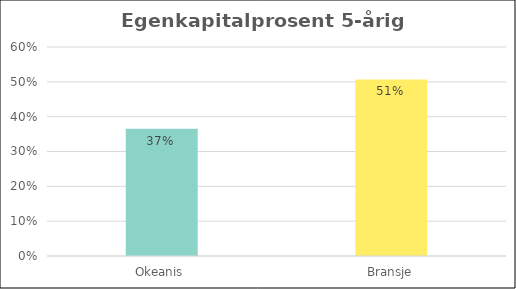
| Category | Series 0 |
|---|---|
| Okeanis | 0.366 |
| Bransje | 0.507 |